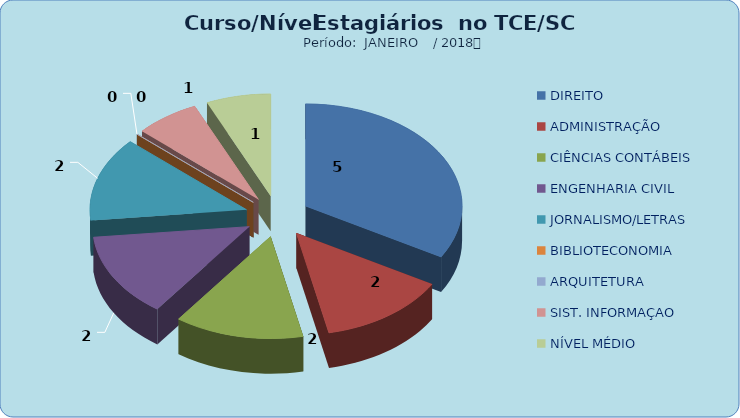
| Category | Series 0 |
|---|---|
| DIREITO | 5 |
| ADMINISTRAÇÃO | 2 |
| CIÊNCIAS CONTÁBEIS | 2 |
| ENGENHARIA CIVIL | 2 |
| JORNALISMO/LETRAS | 2 |
| BIBLIOTECONOMIA | 0 |
| ARQUITETURA | 0 |
| SIST. INFORMAÇAO | 1 |
| NÍVEL MÉDIO | 1 |